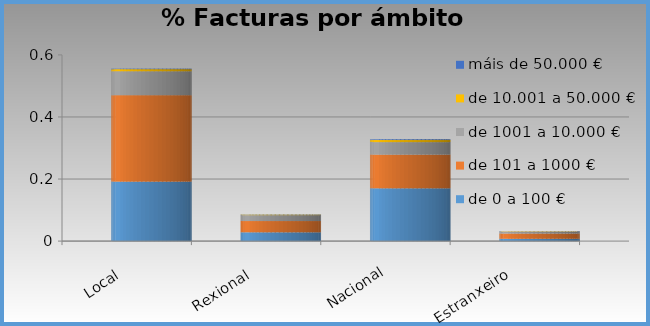
| Category | de 0 a 100 € | de 101 a 1000 € | de 1001 a 10.000 € | de 10.001 a 50.000 € | máis de 50.000 € |
|---|---|---|---|---|---|
| Local | 0.192 | 0.279 | 0.077 | 0.007 | 0.001 |
| Rexional | 0.028 | 0.036 | 0.019 | 0.001 | 0.001 |
| Nacional | 0.17 | 0.109 | 0.04 | 0.007 | 0.002 |
| Estranxeiro | 0.007 | 0.017 | 0.006 | 0.001 | 0 |